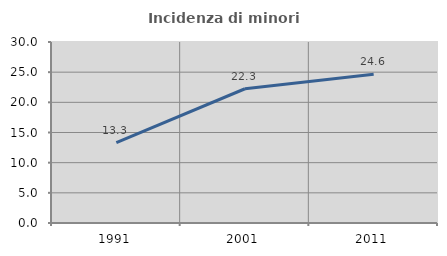
| Category | Incidenza di minori stranieri |
|---|---|
| 1991.0 | 13.333 |
| 2001.0 | 22.25 |
| 2011.0 | 24.637 |